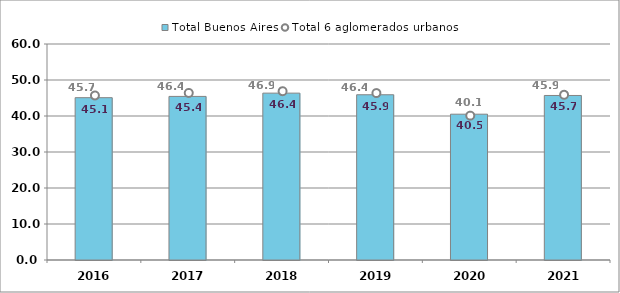
| Category | Total Buenos Aires |
|---|---|
| 2016.0 | 45.09 |
| 2017.0 | 45.44 |
| 2018.0 | 46.35 |
| 2019.0 | 45.9 |
| 2020.0 | 40.5 |
| 2021.0 | 45.7 |